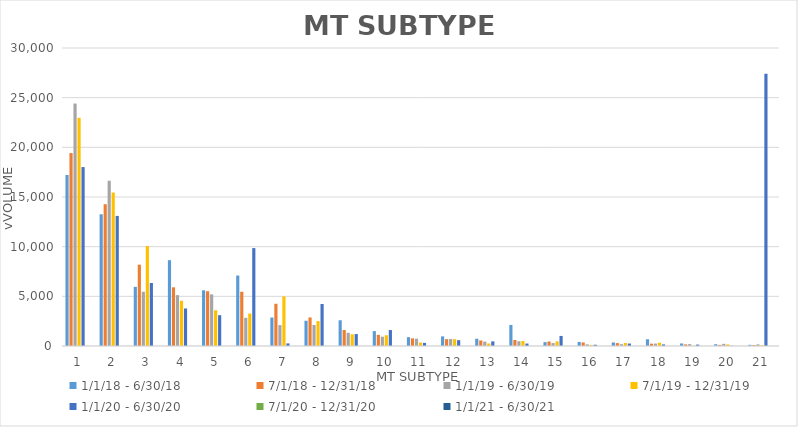
| Category | 1/1/18 - 6/30/18 | 7/1/18 - 12/31/18 | 1/1/19 - 6/30/19 | 7/1/19 - 12/31/19 | 1/1/20 - 6/30/20 | 7/1/20 - 12/31/20 | 1/1/21 - 6/30/21 |
|---|---|---|---|---|---|---|---|
| 1 | 17215 | 19422 | 24408 | 22969 | 18013 | 0 | 0 |
| 2 | 13262 | 14270 | 16636 | 15447 | 13096 | 0 | 0 |
| 3 | 5955 | 8188 | 5463 | 10062 | 6345 | 0 | 0 |
| 4 | 8641 | 5907 | 5119 | 4550 | 3779 | 0 | 0 |
| 5 | 5606 | 5514 | 5198 | 3596 | 3100 | 0 | 0 |
| 6 | 7093 | 5464 | 2836 | 3262 | 9857 | 0 | 0 |
| 7 | 2864 | 4252 | 2104 | 4991 | 261 | 0 | 0 |
| 8 | 2543 | 2871 | 2118 | 2504 | 4227 | 0 | 0 |
| 9 | 2593 | 1612 | 1328 | 1180 | 1204 | 0 | 0 |
| 10 | 1498 | 1125 | 936 | 1079 | 1607 | 0 | 0 |
| 11 | 888 | 767 | 735 | 346 | 312 | 0 | 0 |
| 12 | 969 | 687 | 702 | 685 | 586 | 0 | 0 |
| 13 | 730 | 559 | 441 | 254 | 464 | 0 | 0 |
| 14 | 2119 | 600 | 477 | 498 | 247 | 0 | 0 |
| 15 | 393 | 453 | 296 | 461 | 1012 | 0 | 0 |
| 16 | 408 | 353 | 164 | 114 | 127 | 0 | 0 |
| 17 | 356 | 294 | 186 | 297 | 248 | 0 | 0 |
| 18 | 677 | 235 | 246 | 327 | 159 | 0 | 0 |
| 19 | 254 | 160 | 187 | 32 | 141 | 0 | 0 |
| 20 | 176 | 112 | 217 | 157 | 22 | 0 | 0 |
| 21 | 118 | 98 | 163 | 76 | 27412 | 0 | 0 |